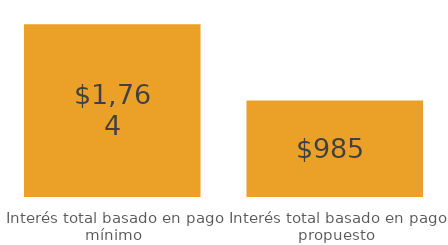
| Category | Series 0 |
|---|---|
| Interés total basado en pago mínimo | 1763.952 |
| Interés total basado en pago propuesto | 984.811 |